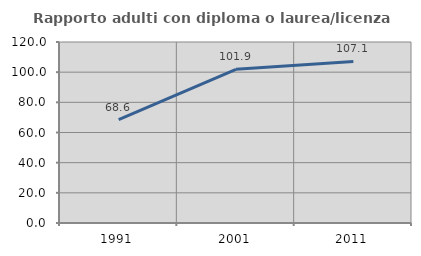
| Category | Rapporto adulti con diploma o laurea/licenza media  |
|---|---|
| 1991.0 | 68.571 |
| 2001.0 | 101.887 |
| 2011.0 | 107.08 |